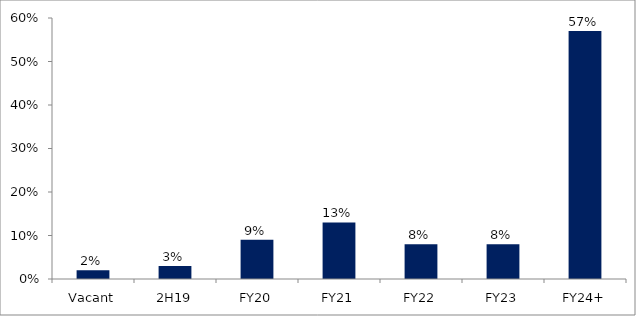
| Category | Series 0 |
|---|---|
| Vacant | 0.02 |
| 2H19 | 0.03 |
| FY20 | 0.09 |
| FY21 | 0.13 |
| FY22 | 0.08 |
| FY23 | 0.08 |
| FY24+ | 0.57 |